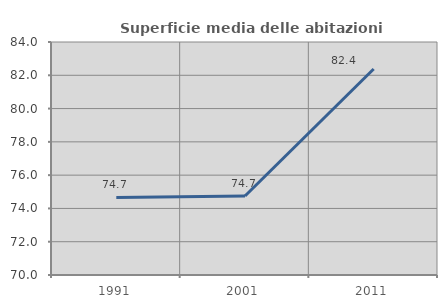
| Category | Superficie media delle abitazioni occupate |
|---|---|
| 1991.0 | 74.657 |
| 2001.0 | 74.747 |
| 2011.0 | 82.378 |